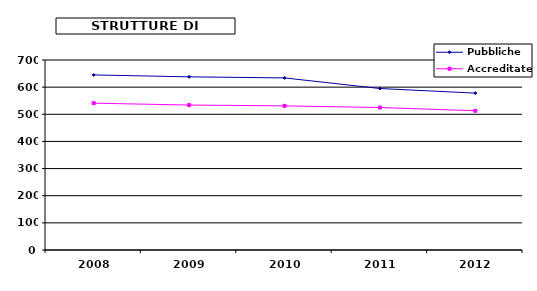
| Category | Pubbliche | Accreditate |
|---|---|---|
| 2008.0 | 645 | 541 |
| 2009.0 | 638 | 534 |
| 2010.0 | 634 | 531 |
| 2011.0 | 595 | 525 |
| 2012.0 | 578 | 513 |